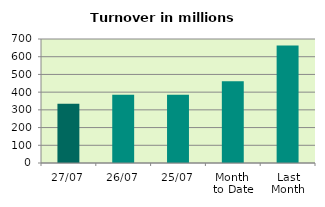
| Category | Series 0 |
|---|---|
| 27/07 | 334.418 |
| 26/07 | 385.967 |
| 25/07 | 385.122 |
| Month 
to Date | 461.699 |
| Last
Month | 663.186 |